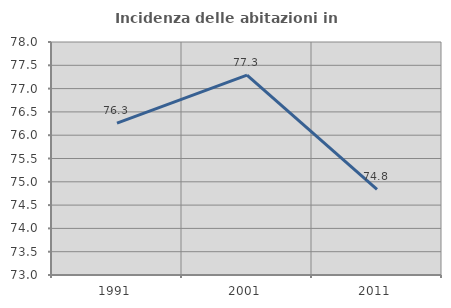
| Category | Incidenza delle abitazioni in proprietà  |
|---|---|
| 1991.0 | 76.259 |
| 2001.0 | 77.288 |
| 2011.0 | 74.837 |